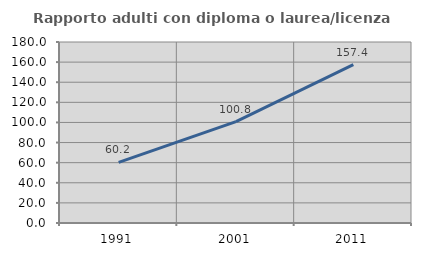
| Category | Rapporto adulti con diploma o laurea/licenza media  |
|---|---|
| 1991.0 | 60.208 |
| 2001.0 | 100.81 |
| 2011.0 | 157.436 |